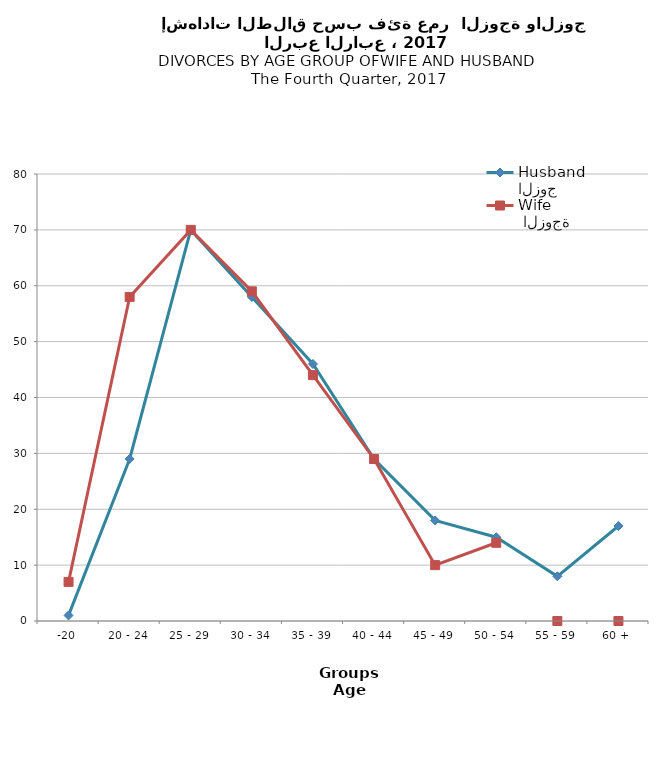
| Category | الزوج
Husband |  الزوجة
Wife |
|---|---|---|
| -20 | 1 | 7 |
| 20 - 24 | 29 | 58 |
| 25 - 29 | 70 | 70 |
| 30 - 34 | 58 | 59 |
| 35 - 39 | 46 | 44 |
| 40 - 44 | 29 | 29 |
| 45 - 49 | 18 | 10 |
| 50 - 54 | 15 | 14 |
| 55 - 59 | 8 | 0 |
| 60 + | 17 | 0 |